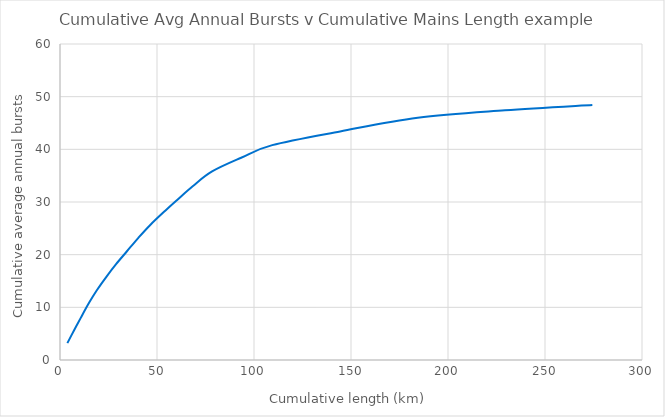
| Category | Cumulative length |
|---|---|
| 3.8 | 3.2 |
| 7.199999999999999 | 5.6 |
| 10.7 | 8 |
| 14.899999999999999 | 10.8 |
| 18.9 | 13.2 |
| 23.9 | 15.8 |
| 28.9 | 18.2 |
| 34.4 | 20.6 |
| 40.4 | 23.2 |
| 46.4 | 25.6 |
| 54.4 | 28.4 |
| 60.4 | 30.4 |
| 68.4 | 33 |
| 78.4 | 35.8 |
| 93.4 | 38.4 |
| 109.4 | 40.8 |
| 144.4 | 43.4 |
| 184.4 | 46 |
| 229.4 | 47.4 |
| 274.4 | 48.4 |